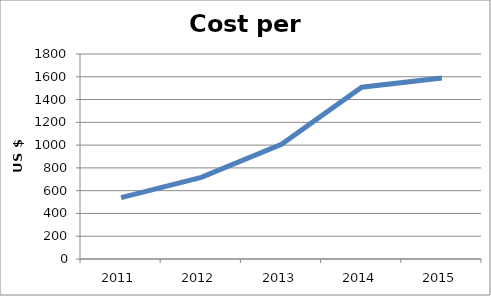
| Category | Cost per APM |
|---|---|
| 2011.0 | 539.049 |
| 2012.0 | 717.154 |
| 2013.0 | 1006.25 |
| 2014.0 | 1508.234 |
| 2015.0 | 1588.436 |